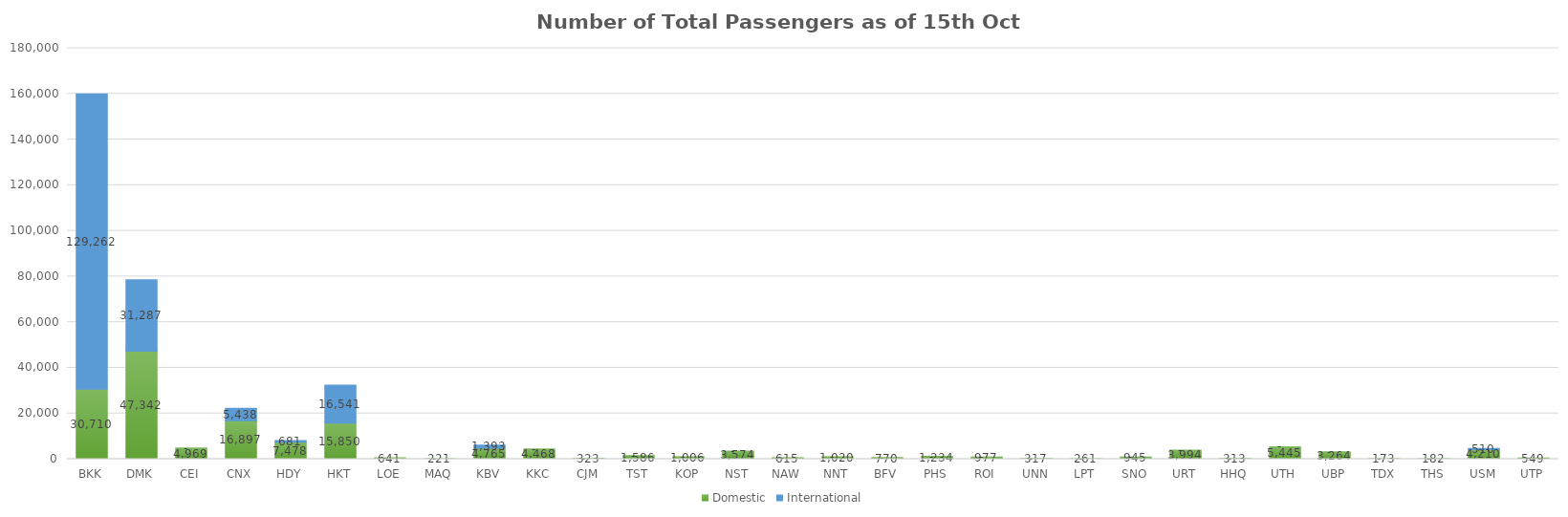
| Category | Domestic | International |
|---|---|---|
| BKK | 30710 | 129262 |
| DMK | 47342 | 31287 |
| CEI | 4969 | 0 |
| CNX | 16897 | 5438 |
| HDY | 7478 | 681 |
| HKT | 15850 | 16541 |
| LOE | 641 | 0 |
| MAQ | 221 | 0 |
| KBV | 4765 | 1393 |
| KKC | 4468 | 0 |
| CJM | 323 | 0 |
| TST | 1586 | 0 |
| KOP | 1006 | 0 |
| NST | 3574 | 0 |
| NAW | 615 | 0 |
| NNT | 1020 | 0 |
| BFV | 770 | 0 |
| PHS | 1234 | 0 |
| ROI | 977 | 0 |
| UNN | 317 | 0 |
| LPT | 261 | 0 |
| SNO | 945 | 0 |
| URT | 3994 | 0 |
| HHQ | 313 | 0 |
| UTH | 5445 | 0 |
| UBP | 3264 | 0 |
| TDX | 173 | 0 |
| THS | 182 | 0 |
| USM | 4210 | 510 |
| UTP | 549 | 0 |